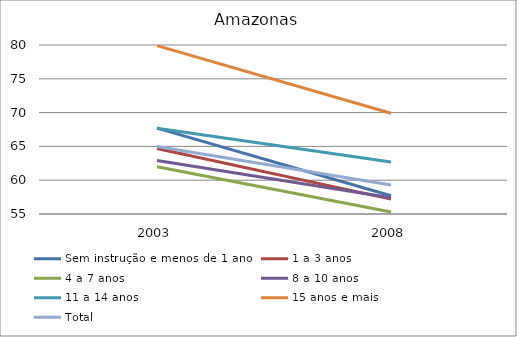
| Category | Sem instrução e menos de 1 ano | 1 a 3 anos | 4 a 7 anos | 8 a 10 anos | 11 a 14 anos | 15 anos e mais | Total |
|---|---|---|---|---|---|---|---|
| 2003.0 | 67.7 | 64.7 | 62 | 62.9 | 67.7 | 79.9 | 65 |
| 2008.0 | 57.7 | 57.2 | 55.3 | 57.4 | 62.7 | 69.9 | 59.3 |